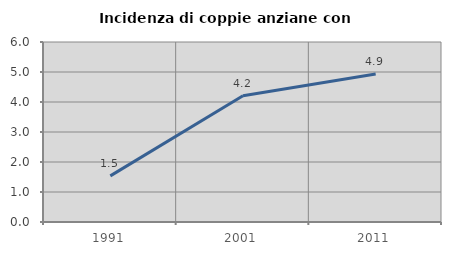
| Category | Incidenza di coppie anziane con figli |
|---|---|
| 1991.0 | 1.538 |
| 2001.0 | 4.206 |
| 2011.0 | 4.933 |